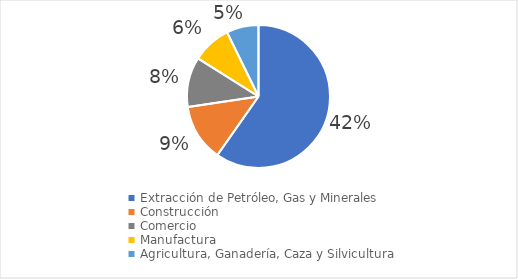
| Category | Series 0 |
|---|---|
| Extracción de Petróleo, Gas y Minerales | 0.416 |
| Construcción | 0.09 |
| Comercio | 0.079 |
| Manufactura | 0.061 |
| Agricultura, Ganadería, Caza y Silvicultura | 0.051 |